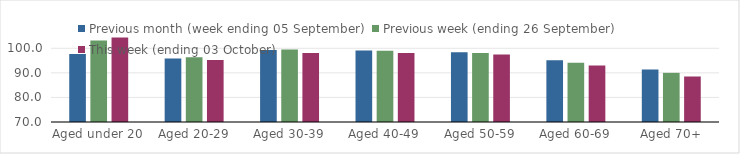
| Category | Previous month (week ending 05 September) | Previous week (ending 26 September) | This week (ending 03 October) |
|---|---|---|---|
| Aged under 20 | 97.67 | 103.12 | 104.34 |
| Aged 20-29 | 95.84 | 96.35 | 95.28 |
| Aged 30-39 | 99.35 | 99.46 | 98.04 |
| Aged 40-49 | 99.13 | 98.99 | 98.13 |
| Aged 50-59 | 98.37 | 98.12 | 97.44 |
| Aged 60-69 | 95.08 | 94.1 | 92.95 |
| Aged 70+ | 91.34 | 90.01 | 88.52 |